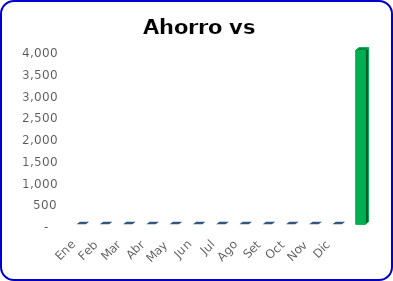
| Category | Ahorro vs Meta |
|---|---|
| Ene | 0 |
| Feb | 0 |
| Mar | 0 |
| Abr | 0 |
| May | 0 |
| Jun | 0 |
| Jul | 0 |
| Ago | 0 |
| Set | 0 |
| Oct | 0 |
| Nov | 0 |
| Dic | 0 |